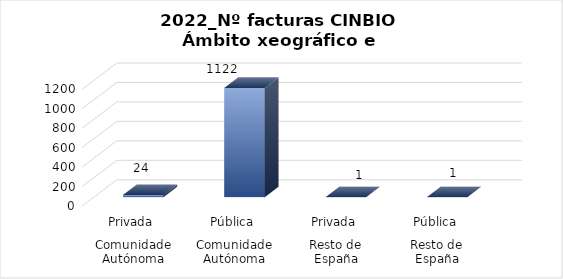
| Category | Series 0 |
|---|---|
| 0 | 24 |
| 1 | 1122 |
| 2 | 1 |
| 3 | 1 |